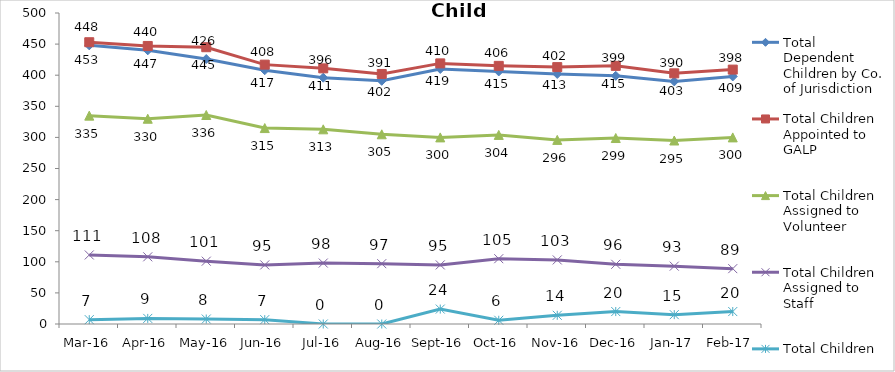
| Category | Total Dependent Children by Co. of Jurisdiction | Total Children Appointed to GALP | Total Children Assigned to Volunteer | Total Children Assigned to Staff | Total Children Unassigned |
|---|---|---|---|---|---|
| Mar-16 | 448 | 453 | 335 | 111 | 7 |
| Apr-16 | 440 | 447 | 330 | 108 | 9 |
| May-16 | 426 | 445 | 336 | 101 | 8 |
| Jun-16 | 408 | 417 | 315 | 95 | 7 |
| Jul-16 | 396 | 411 | 313 | 98 | 0 |
| Aug-16 | 391 | 402 | 305 | 97 | 0 |
| Sep-16 | 410 | 419 | 300 | 95 | 24 |
| Oct-16 | 406 | 415 | 304 | 105 | 6 |
| Nov-16 | 402 | 413 | 296 | 103 | 14 |
| Dec-16 | 399 | 415 | 299 | 96 | 20 |
| Jan-17 | 390 | 403 | 295 | 93 | 15 |
| Feb-17 | 398 | 409 | 300 | 89 | 20 |